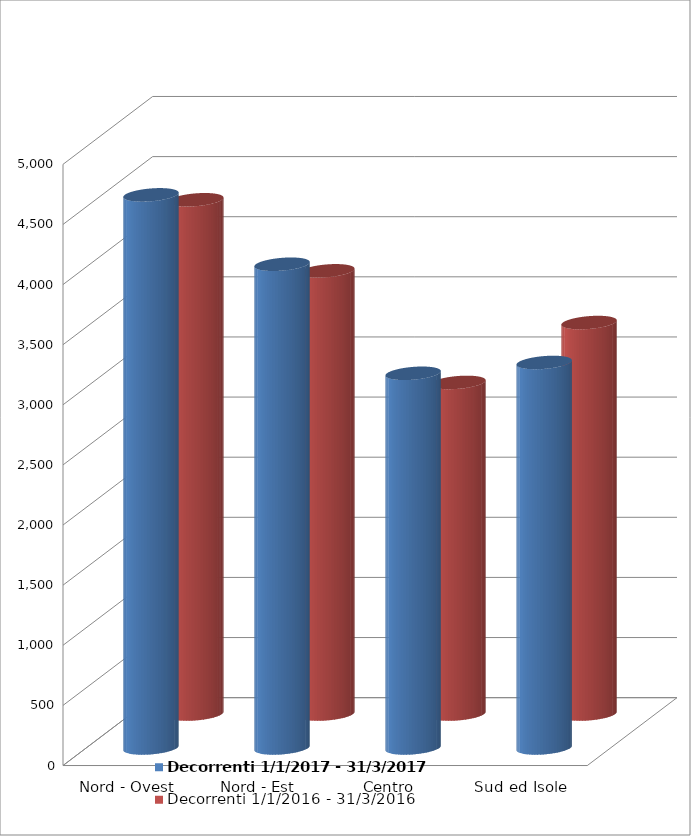
| Category | Decorrenti 1/1/2017 - 31/3/2017 | Decorrenti 1/1/2016 - 31/3/2016 |
|---|---|---|
| Nord - Ovest | 4600 | 4277 |
| Nord - Est | 4023 | 3686 |
| Centro | 3116 | 2758 |
| Sud ed Isole | 3206 | 3256 |